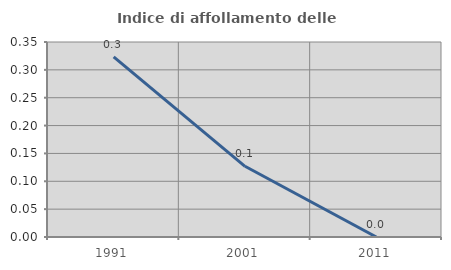
| Category | Indice di affollamento delle abitazioni  |
|---|---|
| 1991.0 | 0.323 |
| 2001.0 | 0.127 |
| 2011.0 | 0 |